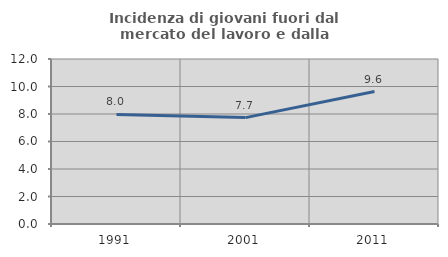
| Category | Incidenza di giovani fuori dal mercato del lavoro e dalla formazione  |
|---|---|
| 1991.0 | 7.965 |
| 2001.0 | 7.737 |
| 2011.0 | 9.63 |